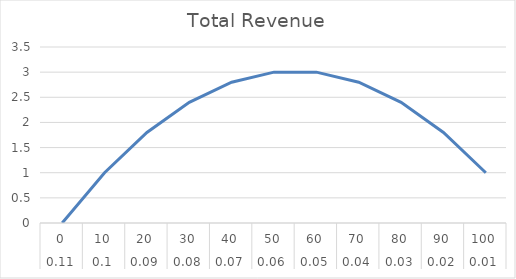
| Category | Total Revenue |
|---|---|
| 0 | 0 |
| 1 | 1 |
| 2 | 1.8 |
| 3 | 2.4 |
| 4 | 2.8 |
| 5 | 3 |
| 6 | 3 |
| 7 | 2.8 |
| 8 | 2.4 |
| 9 | 1.8 |
| 10 | 1 |